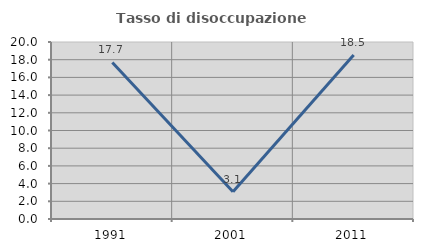
| Category | Tasso di disoccupazione giovanile  |
|---|---|
| 1991.0 | 17.692 |
| 2001.0 | 3.077 |
| 2011.0 | 18.519 |